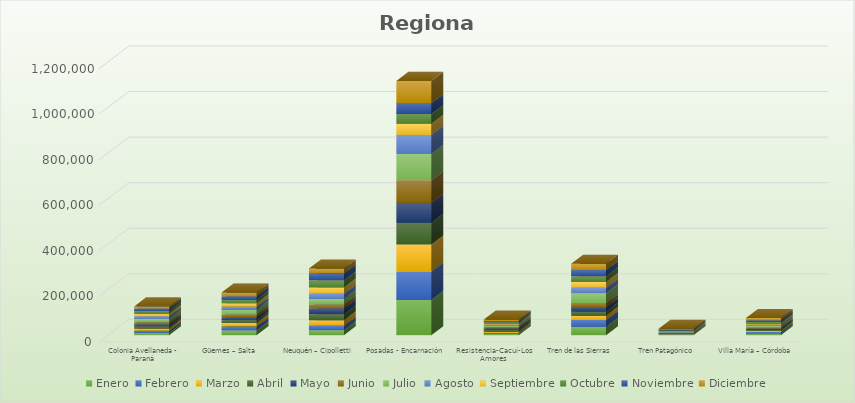
| Category | Enero | Febrero | Marzo | Abril | Mayo | Junio | Julio | Agosto | Septiembre | Octubre | Noviembre | Diciembre |
|---|---|---|---|---|---|---|---|---|---|---|---|---|
| Colonia Avellaneda - Paraná | 10021 | 9461 | 9946 | 9157 | 9042 | 9755 | 13933 | 12173 | 11050 | 12141 | 10858 | 9043 |
| Güemes – Salta | 20707 | 17423 | 15440 | 11664 | 14120 | 11847 | 19853 | 14122 | 15008 | 15781 | 15094 | 16136 |
| Neuquén – Cipolletti | 21642 | 19975 | 24216 | 26278 | 26329 | 16863 | 23405 | 23124 | 28016 | 30917 | 30138 | 21859 |
| Posadas - Encarnación | 155033 | 124991 | 118258 | 95871 | 87560 | 98304 | 115983 | 83026 | 48915 | 42945 | 48085 | 97382 |
| Resistencia-Cacuí-Los Amores | 5471 | 4557 | 5588 | 9116 | 6205 | 4497 | 5507 | 4744 | 5411 | 5629 | 5577 | 6662 |
| Tren de las Sierras | 36682 | 30315 | 18952 | 17779 | 19598 | 17907 | 42776 | 23902 | 25836 | 25607 | 26564 | 27984 |
| Tren Patagónico | 2070 | 1795 | 1773 | 1459 | 1059 | 1804 | 2932 | 2294 | 2236 | 2853 | 4180 | 3852 |
| Villa María – Córdoba | 7458 | 6901 | 5230 | 5330 | 4704 | 3107 | 7280 | 5877 | 5501 | 7420 | 7224 | 9022 |